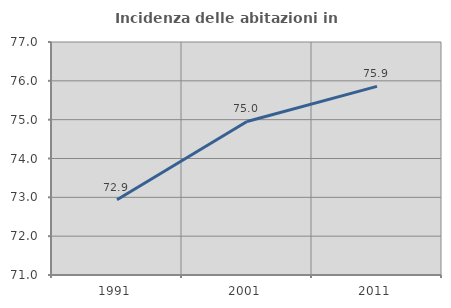
| Category | Incidenza delle abitazioni in proprietà  |
|---|---|
| 1991.0 | 72.936 |
| 2001.0 | 74.953 |
| 2011.0 | 75.857 |